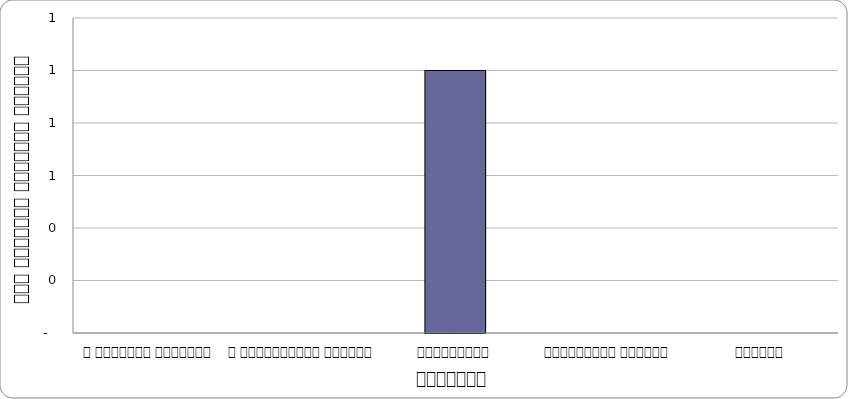
| Category | आन्दोलन |
|---|---|
| द हिमालयन टाइम्स् | 0 |
| द काठमाण्डौं पोस्ट् | 0 |
| कान्तिपुर | 1 |
| अन्नपूर्ण पोस्ट् | 0 |
| नागरिक | 0 |